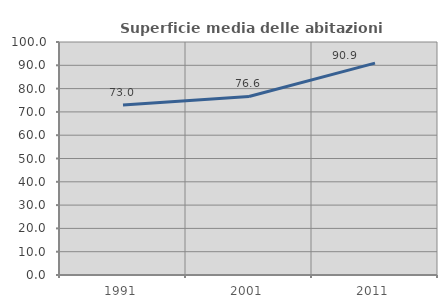
| Category | Superficie media delle abitazioni occupate |
|---|---|
| 1991.0 | 72.984 |
| 2001.0 | 76.639 |
| 2011.0 | 90.949 |